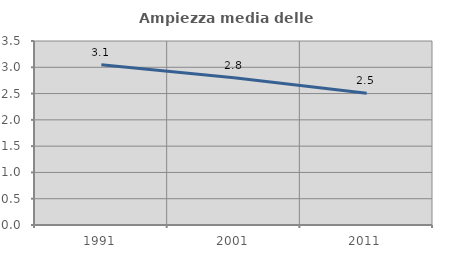
| Category | Ampiezza media delle famiglie |
|---|---|
| 1991.0 | 3.05 |
| 2001.0 | 2.799 |
| 2011.0 | 2.505 |